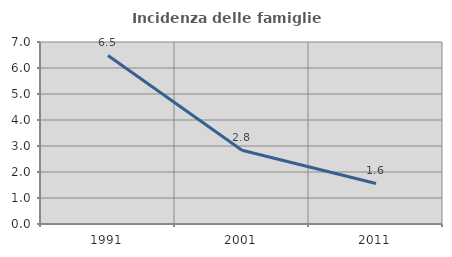
| Category | Incidenza delle famiglie numerose |
|---|---|
| 1991.0 | 6.483 |
| 2001.0 | 2.837 |
| 2011.0 | 1.561 |